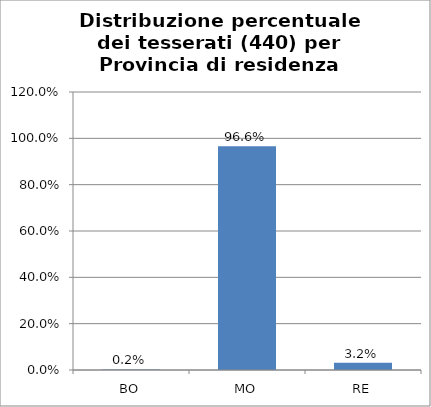
| Category | % Tesserati |
|---|---|
| BO | 0.002 |
| MO | 0.966 |
| RE | 0.032 |